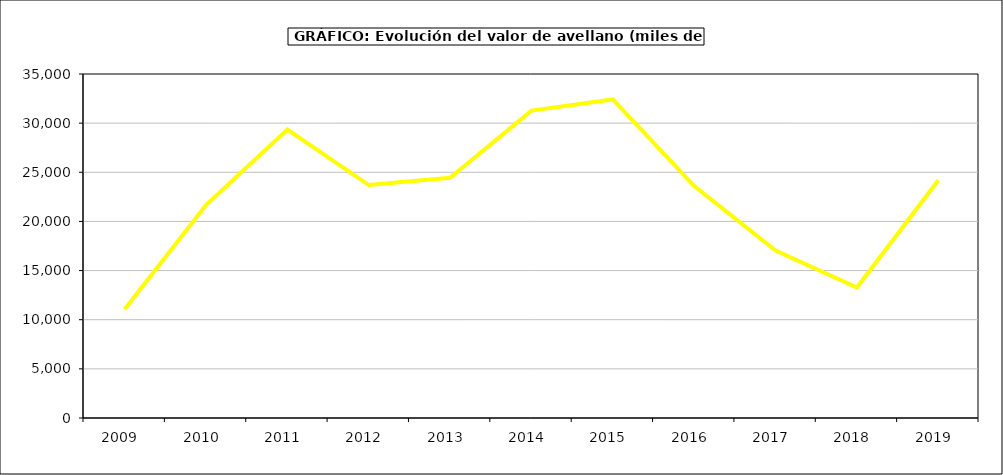
| Category | valor avellano |
|---|---|
| 2009.0 | 11073.069 |
| 2010.0 | 21658.97 |
| 2011.0 | 29345.397 |
| 2012.0 | 23700.751 |
| 2013.0 | 24448.005 |
| 2014.0 | 31273.096 |
| 2015.0 | 32413 |
| 2016.0 | 23592 |
| 2017.0 | 17033.361 |
| 2018.0 | 13279.352 |
| 2019.0 | 24182.831 |